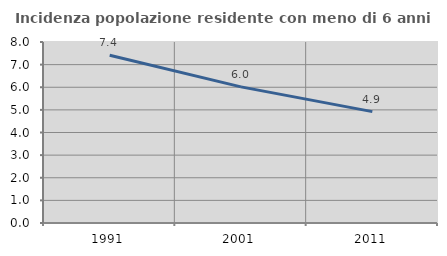
| Category | Incidenza popolazione residente con meno di 6 anni |
|---|---|
| 1991.0 | 7.412 |
| 2001.0 | 6.016 |
| 2011.0 | 4.923 |